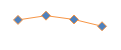
| Category | Series 0 |
|---|---|
| 0 | -0.091 |
| 1 | 0.182 |
| 2 | -0.062 |
| 3 | -0.5 |